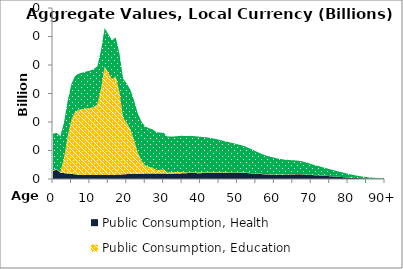
| Category | Public Consumption, Health | Public Consumption, Education | Public Consumption, Other than health and education |
|---|---|---|---|
| 0 | 1.405 | 0.101 | 6.444 |
|  | 1.643 | 0.099 | 6.357 |
| 2 | 1.111 | 0.098 | 6.301 |
| 3 | 1.033 | 2.701 | 6.272 |
| 4 | 0.96 | 6.568 | 6.266 |
| 5 | 0.889 | 9.528 | 6.282 |
| 6 | 0.82 | 10.987 | 6.315 |
| 7 | 0.74 | 11.389 | 6.361 |
| 8 | 0.715 | 11.54 | 6.418 |
| 9 | 0.704 | 11.667 | 6.483 |
| 10 | 0.686 | 11.769 | 6.555 |
| 11 | 0.69 | 11.932 | 6.636 |
| 12 | 0.689 | 12.363 | 6.703 |
| 13 | 0.689 | 15.096 | 6.743 |
| 14 | 0.699 | 19.024 | 6.767 |
| 15 | 0.723 | 17.902 | 6.791 |
| 16 | 0.741 | 16.782 | 6.811 |
| 17 | 0.76 | 17.246 | 6.834 |
| 18 | 0.779 | 14.466 | 6.865 |
| 19 | 0.813 | 9.911 | 6.898 |
| 20 | 0.86 | 8.968 | 6.923 |
| 21 | 0.882 | 7.8 | 6.943 |
| 22 | 0.882 | 5.905 | 6.945 |
| 23 | 0.92 | 3.654 | 6.922 |
| 24 | 0.928 | 2.264 | 6.88 |
| 25 | 0.953 | 1.422 | 6.839 |
| 26 | 0.952 | 1.164 | 6.799 |
| 27 | 0.966 | 1.019 | 6.738 |
| 28 | 0.984 | 0.592 | 6.649 |
| 29 | 0.983 | 0.617 | 6.545 |
| 30 | 0.967 | 0.69 | 6.441 |
| 31 | 0.933 | 0.186 | 6.326 |
| 32 | 0.93 | 0.268 | 6.26 |
| 33 | 0.958 | 0.25 | 6.269 |
| 34 | 0.955 | 0.254 | 6.325 |
| 35 | 1.001 | 0.229 | 6.369 |
| 36 | 1.019 | 0.1 | 6.413 |
| 37 | 1.048 | 0.1 | 6.43 |
| 38 | 1.038 | 0.1 | 6.402 |
| 39 | 1.03 | 0.099 | 6.34 |
| 40 | 1.026 | 0.098 | 6.277 |
| 41 | 1.042 | 0.097 | 6.21 |
| 42 | 1.064 | 0.096 | 6.121 |
| 43 | 1.061 | 0.094 | 6.005 |
| 44 | 1.083 | 0.092 | 5.868 |
| 45 | 1.081 | 0.089 | 5.721 |
| 46 | 1.076 | 0.087 | 5.56 |
| 47 | 1.084 | 0.084 | 5.401 |
| 48 | 1.075 | 0.082 | 5.251 |
| 49 | 1.076 | 0.08 | 5.103 |
| 50 | 1.076 | 0.077 | 4.948 |
| 51 | 1.074 | 0.075 | 4.794 |
| 52 | 1.064 | 0.072 | 4.608 |
| 53 | 1.021 | 0.068 | 4.379 |
| 54 | 0.991 | 0.064 | 4.123 |
| 55 | 0.929 | 0.06 | 3.873 |
| 56 | 0.883 | 0.057 | 3.622 |
| 57 | 0.835 | 0.053 | 3.4 |
| 58 | 0.795 | 0.05 | 3.224 |
| 59 | 0.771 | 0.048 | 3.08 |
| 60 | 0.753 | 0.046 | 2.936 |
| 61 | 0.74 | 0.044 | 2.791 |
| 62 | 0.764 | 0.042 | 2.671 |
| 63 | 0.757 | 0.04 | 2.583 |
| 64 | 0.789 | 0.039 | 2.514 |
| 65 | 0.789 | 0.038 | 2.448 |
| 66 | 0.833 | 0.037 | 2.391 |
| 67 | 0.823 | 0.036 | 2.309 |
| 68 | 0.79 | 0.034 | 2.184 |
| 69 | 0.77 | 0.032 | 2.032 |
| 70 | 0.706 | 0.029 | 1.886 |
| 71 | 0.665 | 0.027 | 1.741 |
| 72 | 0.645 | 0.025 | 1.6 |
| 73 | 0.578 | 0.023 | 1.468 |
| 74 | 0.542 | 0.021 | 1.344 |
| 75 | 0.5 | 0.019 | 1.22 |
| 76 | 0.45 | 0.017 | 1.097 |
| 77 | 0.4 | 0.015 | 0.977 |
| 78 | 0.349 | 0.013 | 0.859 |
| 79 | 0.311 | 0.012 | 0.744 |
| 80 | 0.26 | 0.01 | 0.637 |
| 81 | 0.219 | 0.008 | 0.537 |
| 82 | 0.182 | 0.007 | 0.445 |
| 83 | 0.148 | 0.006 | 0.362 |
| 84 | 0.118 | 0.005 | 0.289 |
| 85 | 0.099 | 0.004 | 0.243 |
| 86 | 0.078 | 0.003 | 0.192 |
| 87 | 0.061 | 0.002 | 0.149 |
| 88 | 0.046 | 0.002 | 0.112 |
| 89 | 0.033 | 0.001 | 0.082 |
| 90+ | 0.069 | 0.003 | 0.168 |